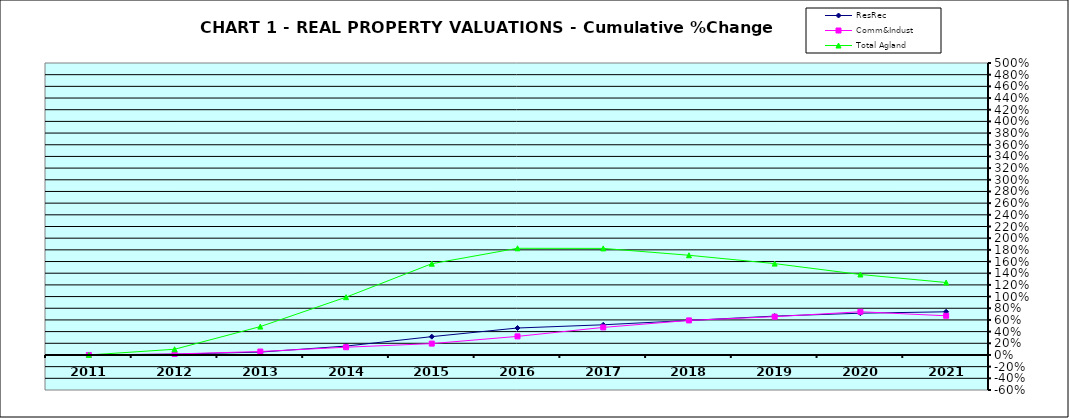
| Category | ResRec | Comm&Indust | Total Agland |
|---|---|---|---|
| 2011.0 | 0 | 0 | 0 |
| 2012.0 | 0.013 | 0.017 | 0.098 |
| 2013.0 | 0.049 | 0.059 | 0.486 |
| 2014.0 | 0.152 | 0.133 | 0.989 |
| 2015.0 | 0.314 | 0.195 | 1.563 |
| 2016.0 | 0.462 | 0.318 | 1.827 |
| 2017.0 | 0.517 | 0.472 | 1.825 |
| 2018.0 | 0.591 | 0.592 | 1.708 |
| 2019.0 | 0.666 | 0.656 | 1.564 |
| 2020.0 | 0.715 | 0.74 | 1.378 |
| 2021.0 | 0.739 | 0.671 | 1.241 |